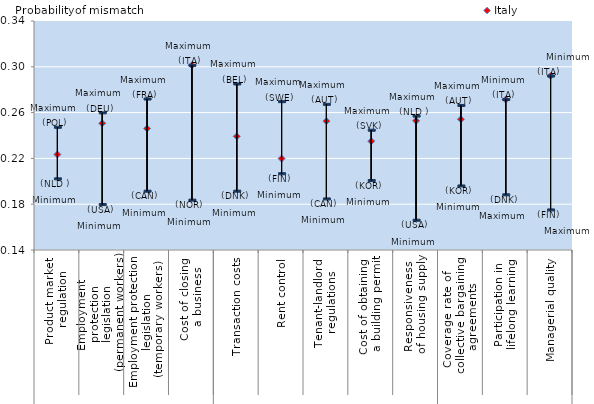
| Category | Italy |  Maximum |  Minimum | max2 | min2 |
|---|---|---|---|---|---|
| 0 | 0.223 | 0.247 | 0.202 | 0.241 | 0.208 |
| 1 | 0.251 | 0.26 | 0.18 | 0.254 | 0.186 |
| 2 | 0.246 | 0.272 | 0.191 | 0.266 | 0.197 |
| 3 | 0.301 | 0.301 | 0.184 | 0.295 | 0.19 |
| 4 | 0.239 | 0.285 | 0.191 | 0.279 | 0.197 |
| 5 | 0.22 | 0.27 | 0.207 | 0.264 | 0.213 |
| 6 | 0.253 | 0.267 | 0.185 | 0.261 | 0.191 |
| 7 | 0.235 | 0.245 | 0.201 | 0.239 | 0.207 |
| 8 | 0.253 | 0.257 | 0.166 | 0.251 | 0.172 |
| 9 | 0.254 | 0.266 | 0.196 | 0.26 | 0.202 |
| 10 | 0.271 | 0.271 | 0.188 | 0.265 | 0.194 |
| 11 | 0.292 | 0.292 | 0.175 | 0.286 | 0.181 |